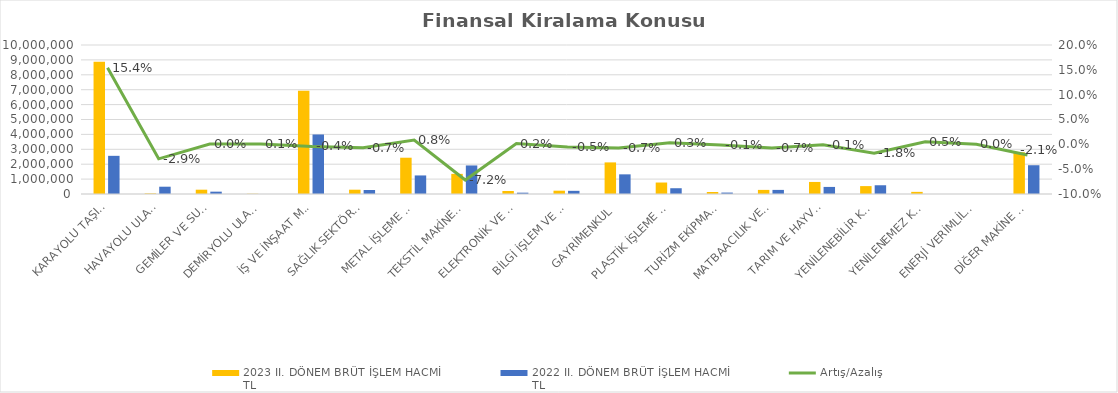
| Category | 2023 II. DÖNEM BRÜT İŞLEM HACMİ 
TL | 2022 II. DÖNEM BRÜT İŞLEM HACMİ 
TL |
|---|---|---|
| KARAYOLU TAŞITLARI | 8869886.67 | 2561742.639 |
| HAVAYOLU ULAŞIM ARAÇLARI | 38868.879 | 489450 |
| GEMİLER VE SUDA YÜZEN TAŞIT VE ARAÇLAR | 288872.541 | 157073.45 |
| DEMİRYOLU ULAŞIM ARAÇLARI | 15840 | 0 |
| İŞ VE İNŞAAT MAKİNELERİ | 6922038.203 | 3994553.274 |
| SAĞLIK SEKTÖRÜ VE ESTETİK EKİPMANLARI | 288642.842 | 270440.581 |
| METAL İŞLEME MAKİNELERİ | 2435248.719 | 1245471.901 |
| TEKSTİL MAKİNELERİ | 1351659.799 | 1916463.133 |
| ELEKTRONİK VE OPTİK CİHAZLAR | 202923.514 | 88711.345 |
| BİLGİ İŞLEM VE BÜRO SİSTEMLERİ | 222293.56 | 212769.996 |
| GAYRİMENKUL | 2120988.169 | 1319346.568 |
| PLASTİK İŞLEME MAKİNELERİ | 769887.837 | 387369.645 |
| TURİZM EKİPMANLARI | 136014.296 | 95714.34 |
| MATBAACILIK VE KAĞIT İŞLEME MAKİNELERİ | 275821.514 | 275103.573 |
| TARIM VE HAYVANCILIK MAKİNELERİ | 808381.718 | 474855.981 |
| YENİLENEBİLİR KAYNAKLI ELEKTRİK ENERJİSİ ÜRETİM EKİPMANLARI | 530142.575 | 586679.66 |
| YENİLENEMEZ KAYNAKLI ELEKTRİK ENERJİSİ ÜRETİM EKİPMANLARI | 143388 | 0 |
| ENERJİ VERİMLİLİĞİ EKİPMANLARI | 0 | 0 |
| DİĞER MAKİNE VE EKİPMANLAR | 2801371.744 | 1931053.952 |